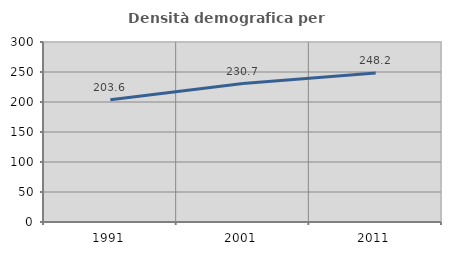
| Category | Densità demografica |
|---|---|
| 1991.0 | 203.643 |
| 2001.0 | 230.742 |
| 2011.0 | 248.156 |